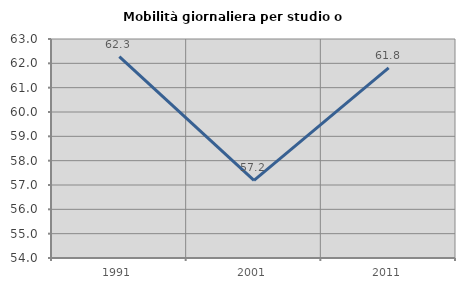
| Category | Mobilità giornaliera per studio o lavoro |
|---|---|
| 1991.0 | 62.276 |
| 2001.0 | 57.191 |
| 2011.0 | 61.817 |